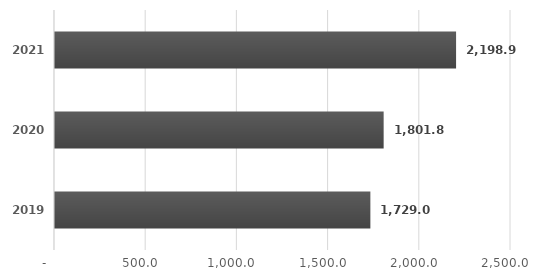
| Category | Series 0 |
|---|---|
| 2019.0 | 1729 |
| 2020.0 | 1801.8 |
| 2021.0 | 2198.9 |